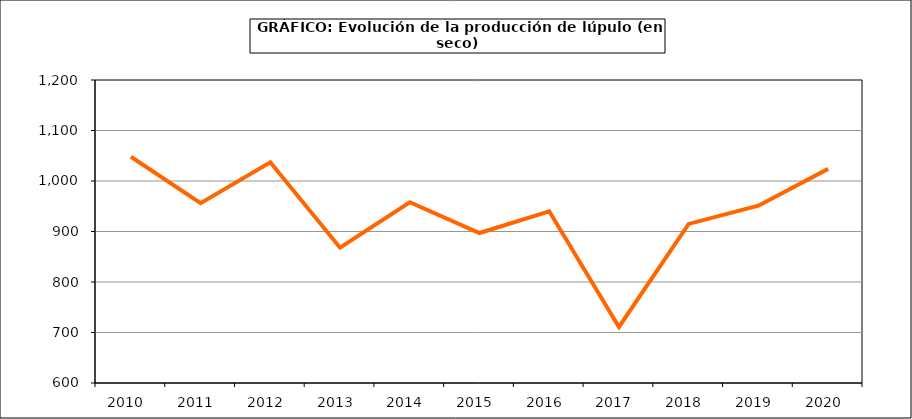
| Category | Superficie |
|---|---|
| 2010.0 | 1048 |
| 2011.0 | 956 |
| 2012.0 | 1037 |
| 2013.0 | 868 |
| 2014.0 | 958 |
| 2015.0 | 897 |
| 2016.0 | 940 |
| 2017.0 | 711 |
| 2018.0 | 915 |
| 2019.0 | 951 |
| 2020.0 | 1024 |